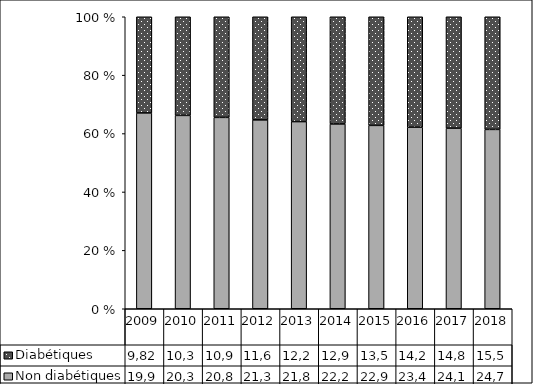
| Category | Non diabétiques | Diabétiques |
|---|---|---|
| 2009.0 | 19998 | 9823 |
| 2010.0 | 20369 | 10391 |
| 2011.0 | 20846 | 10960 |
| 2012.0 | 21321 | 11640 |
| 2013.0 | 21836 | 12234 |
| 2014.0 | 22269 | 12919 |
| 2015.0 | 22915 | 13572 |
| 2016.0 | 23478 | 14292 |
| 2017.0 | 24113 | 14885 |
| 2018.0 | 24746 | 15543 |